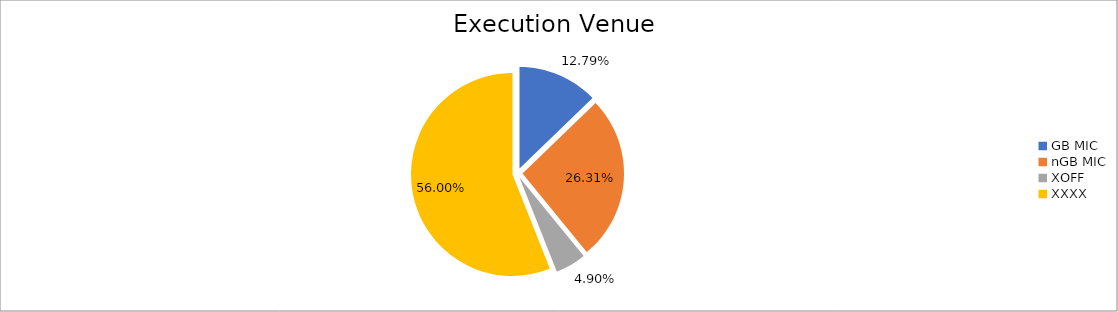
| Category | Series 0 |
|---|---|
| GB MIC | 1183526.15 |
| nGB MIC | 2434454.031 |
| XOFF | 453412.384 |
| XXXX | 5182090.718 |